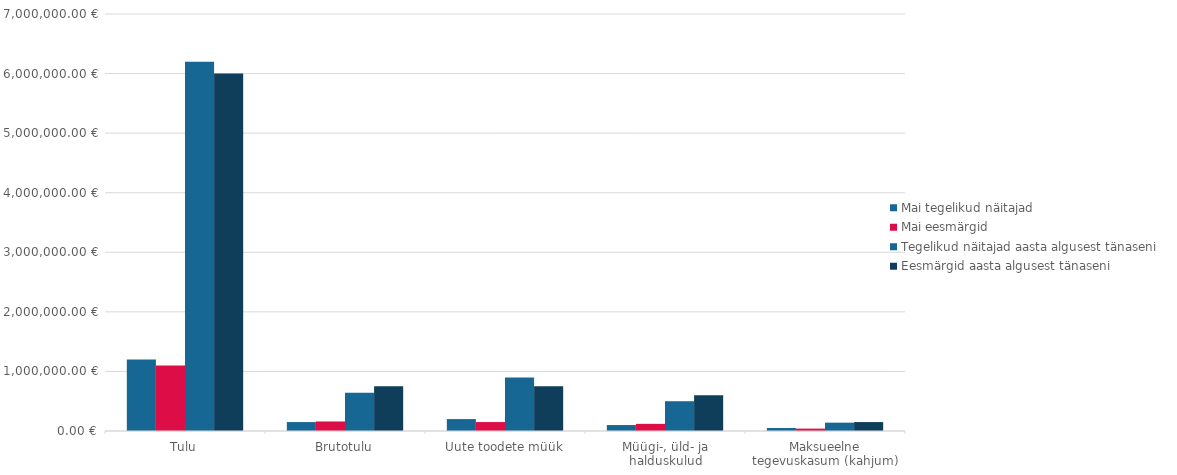
| Category | Mai tegelikud näitajad | Mai eesmärgid | Tegelikud näitajad aasta algusest tänaseni | Eesmärgid aasta algusest tänaseni |
|---|---|---|---|---|
| Tulu | 1200000 | 1100000 | 6200000 | 6000000 |
| Brutotulu | 150000 | 160000 | 640000 | 750000 |
| Uute toodete müük | 200000 | 150000 | 900000 | 750000 |
| Müügi-, üld- ja halduskulud | 100000 | 120000 | 500000 | 600000 |
| Maksueelne tegevuskasum (kahjum) | 50000 | 40000 | 140000 | 150000 |